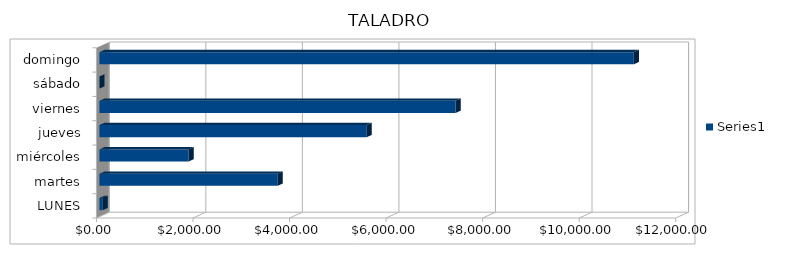
| Category | Series 0 |
|---|---|
| LUNES | 66.42 |
| martes | 3690 |
| miércoles | 1845 |
| jueves | 5535 |
| viernes | 7380 |
| sábado | 0 |
| domingo | 11070 |